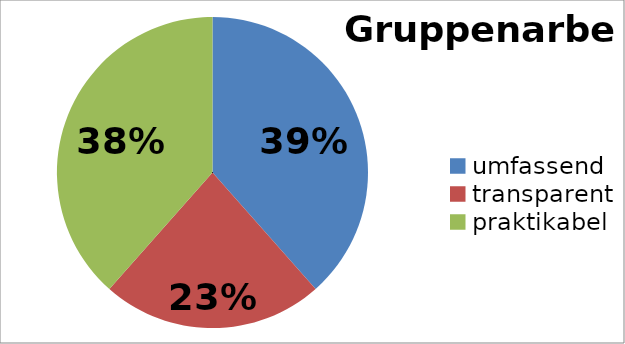
| Category | Gruppenarbeit |
|---|---|
| umfassend | 5 |
| transparent | 3 |
| praktikabel | 5 |